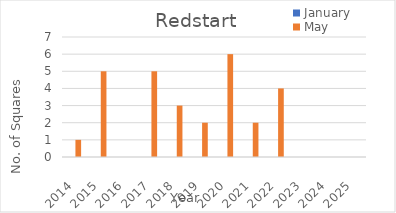
| Category | January | May |
|---|---|---|
| 2014.0 | 0 | 1 |
| 2015.0 | 0 | 5 |
| 2016.0 | 0 | 0 |
| 2017.0 | 0 | 5 |
| 2018.0 | 0 | 3 |
| 2019.0 | 0 | 2 |
| 2020.0 | 0 | 6 |
| 2021.0 | 0 | 2 |
| 2022.0 | 0 | 4 |
| 2023.0 | 0 | 0 |
| 2024.0 | 0 | 0 |
| 2025.0 | 0 | 0 |